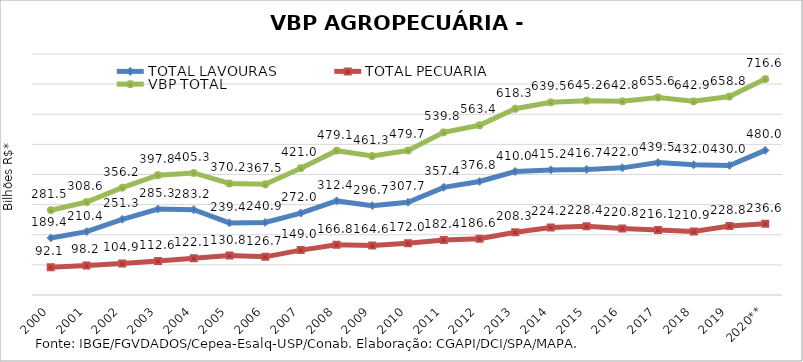
| Category | TOTAL LAVOURAS | TOTAL PECUÁRIA | VBP TOTAL |
|---|---|---|---|
| 2000 | 189.417 | 92.074 | 281.491 |
| 2001 | 210.408 | 98.231 | 308.639 |
| 2002 | 251.339 | 104.862 | 356.201 |
| 2003 | 285.268 | 112.551 | 397.82 |
| 2004 | 283.179 | 122.086 | 405.266 |
| 2005 | 239.415 | 130.784 | 370.199 |
| 2006 | 240.878 | 126.666 | 367.544 |
| 2007 | 272.028 | 149.015 | 421.043 |
| 2008 | 312.355 | 166.784 | 479.139 |
| 2009 | 296.696 | 164.614 | 461.31 |
| 2010 | 307.707 | 171.99 | 479.697 |
| 2011 | 357.363 | 182.437 | 539.801 |
| 2012 | 376.796 | 186.623 | 563.419 |
| 2013 | 409.957 | 208.342 | 618.298 |
| 2014 | 415.231 | 224.235 | 639.466 |
| 2015 | 416.738 | 228.434 | 645.172 |
| 2016 | 422.007 | 220.839 | 642.846 |
| 2017 | 439.541 | 216.093 | 655.635 |
| 2018 | 432.027 | 210.867 | 642.894 |
| 2019 | 429.957 | 228.843 | 658.799 |
| 2020** | 479.987 | 236.646 | 716.634 |